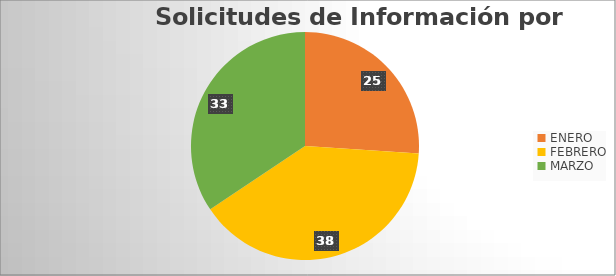
| Category | Series 0 |
|---|---|
| ENERO | 25 |
| FEBRERO | 38 |
| MARZO | 33 |